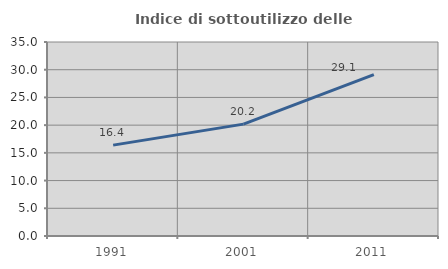
| Category | Indice di sottoutilizzo delle abitazioni  |
|---|---|
| 1991.0 | 16.393 |
| 2001.0 | 20.183 |
| 2011.0 | 29.113 |